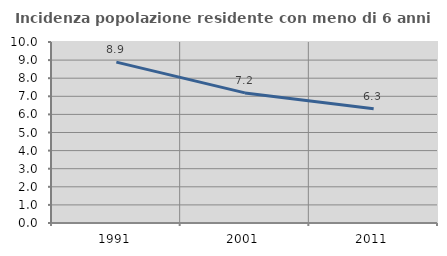
| Category | Incidenza popolazione residente con meno di 6 anni |
|---|---|
| 1991.0 | 8.89 |
| 2001.0 | 7.187 |
| 2011.0 | 6.309 |